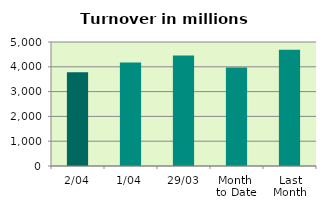
| Category | Series 0 |
|---|---|
| 2/04 | 3777.07 |
| 1/04 | 4170.279 |
| 29/03 | 4457.571 |
| Month 
to Date | 3973.674 |
| Last
Month | 4683.179 |